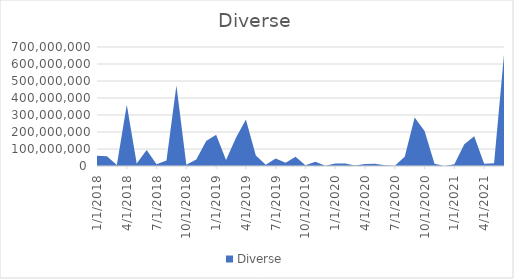
| Category | Diverse |
|---|---|
| 1/1/18 | 60850000 |
| 2/1/18 | 57500000 |
| 3/1/18 | 6250000 |
| 4/1/18 | 360000000 |
| 5/1/18 | 14800000 |
| 6/1/18 | 94150000 |
| 7/1/18 | 9850000 |
| 8/1/18 | 32150000 |
| 9/1/18 | 474000000 |
| 10/1/18 | 7900000 |
| 11/1/18 | 38400000 |
| 12/1/18 | 146800000 |
| 1/1/19 | 184200000 |
| 2/1/19 | 36000000 |
| 3/1/19 | 165500000 |
| 4/1/19 | 273200000 |
| 5/1/19 | 61250000 |
| 6/1/19 | 8000000 |
| 7/1/19 | 44500000 |
| 8/1/19 | 19400000 |
| 9/1/19 | 54950000 |
| 10/1/19 | 4550000 |
| 11/1/19 | 24350000 |
| 12/1/19 | 1500000 |
| 1/1/20 | 15250000 |
| 2/1/20 | 15000000 |
| 3/1/20 | 2400000 |
| 4/1/20 | 11500000 |
| 5/1/20 | 13500000 |
| 6/1/20 | 4250000 |
| 7/1/20 | 2000000 |
| 8/1/20 | 54550000 |
| 9/1/20 | 285000000 |
| 10/1/20 | 205250000 |
| 11/1/20 | 12600000 |
| 12/1/20 | 600000 |
| 1/1/21 | 9750000 |
| 2/1/21 | 128000000 |
| 3/1/21 | 174280000 |
| 4/1/21 | 13350000 |
| 5/1/21 | 15600000 |
| 6/1/21 | 656000000 |